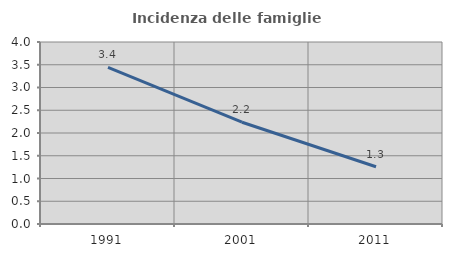
| Category | Incidenza delle famiglie numerose |
|---|---|
| 1991.0 | 3.444 |
| 2001.0 | 2.237 |
| 2011.0 | 1.258 |